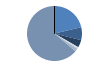
| Category | Series 0 |
|---|---|
| ARRASTRE | 255 |
| CERCO | 91 |
| PALANGRE | 53 |
| REDES DE ENMALLE | 13 |
| ARTES FIJAS | 22 |
| ARTES MENORES | 763 |
| SIN TIPO ASIGNADO | 0 |